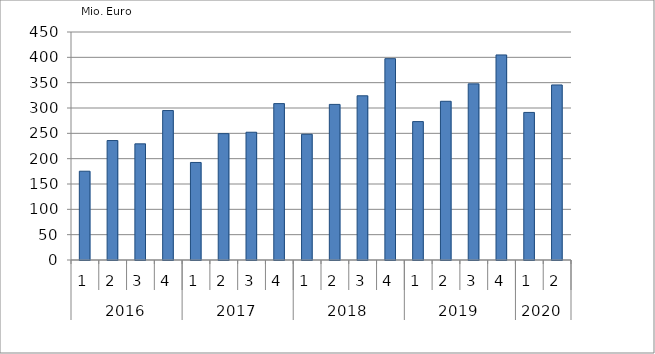
| Category | Ausbaugewerblicher Umsatz3 |
|---|---|
| 0 | 175225.59 |
| 1 | 235781.631 |
| 2 | 229227.559 |
| 3 | 294992.157 |
| 4 | 192499.539 |
| 5 | 249394.388 |
| 6 | 252146.755 |
| 7 | 308653.153 |
| 8 | 248133.418 |
| 9 | 307099.899 |
| 10 | 324088.989 |
| 11 | 397377.201 |
| 12 | 273159.137 |
| 13 | 313254.251 |
| 14 | 347631.281 |
| 15 | 404721.054 |
| 16 | 291272.144 |
| 17 | 345494.215 |